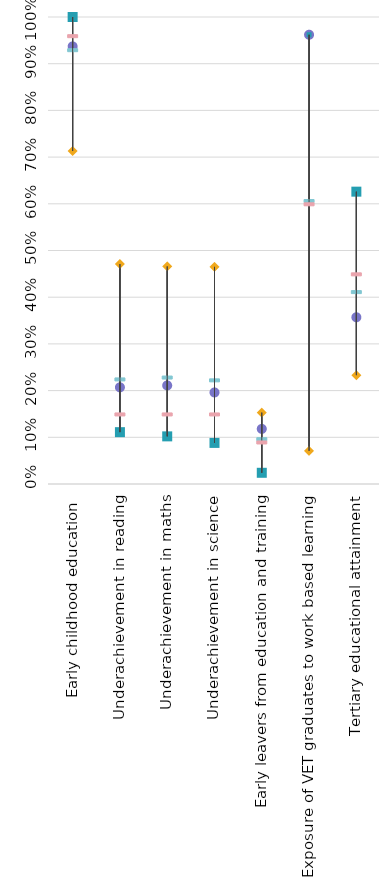
| Category | 93.7% | Strongest performer | Weakest performer | EU average | EU target |
|---|---|---|---|---|---|
| Early childhood education  | 0.937 | 1 | 0.713 | 0.93 | 0.96 |
| Underachievement in reading | 0.207 | 0.111 | 0.471 | 0.225 | 0.15 |
| Underachievement in maths | 0.211 | 0.102 | 0.466 | 0.229 | 0.15 |
| Underachievement in science | 0.196 | 0.088 | 0.465 | 0.223 | 0.15 |
| Early leavers from education and training | 0.118 | 0.024 | 0.153 | 0.097 | 0.09 |
| Exposure of VET graduates to work based learning  | 0.962 | 0.962 | 0.071 | 0.607 | 0.6 |
| Tertiary educational attainment | 0.357 | 0.626 | 0.233 | 0.412 | 0.45 |